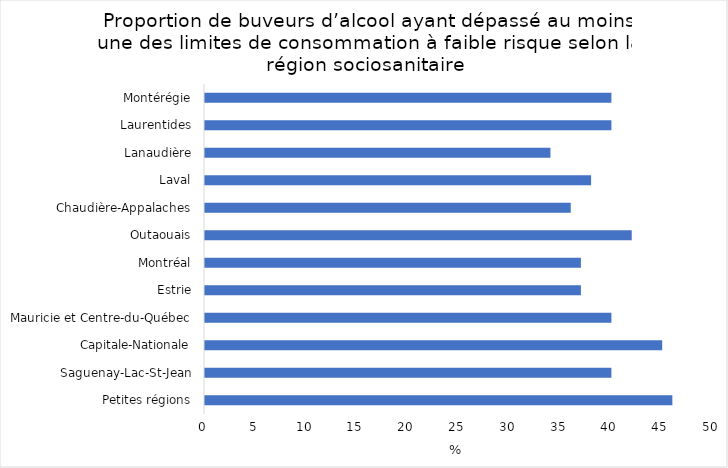
| Category | Series 0 |
|---|---|
| Petites régions | 46 |
| Saguenay-Lac-St-Jean | 40 |
| Capitale-Nationale | 45 |
| Mauricie et Centre-du-Québec | 40 |
| Estrie | 37 |
| Montréal | 37 |
| Outaouais | 42 |
| Chaudière-Appalaches | 36 |
| Laval | 38 |
| Lanaudière | 34 |
| Laurentides | 40 |
| Montérégie | 40 |